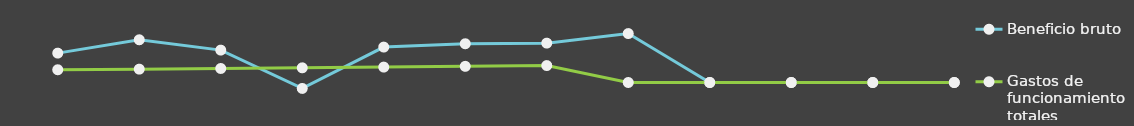
| Category | Beneficio bruto | Gastos de funcionamiento totales |
|---|---|---|
| 0 | 25000 | 10841 |
| 1 | 36348 | 11367.25 |
| 2 | 27562 | 11919.82 |
| 3 | -5059.5 | 12500.01 |
| 4 | 30153.18 | 13109.21 |
| 5 | 32964.45 | 13748.86 |
| 6 | 33502.87 | 14420.51 |
| 7 | 41646 | 0 |
| 8 | 0 | 0 |
| 9 | 0 | 0 |
| 10 | 0 | 0 |
| 11 | 0 | 0 |